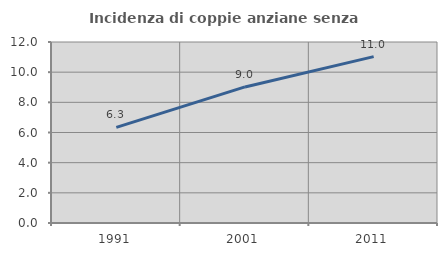
| Category | Incidenza di coppie anziane senza figli  |
|---|---|
| 1991.0 | 6.339 |
| 2001.0 | 9.021 |
| 2011.0 | 11.029 |